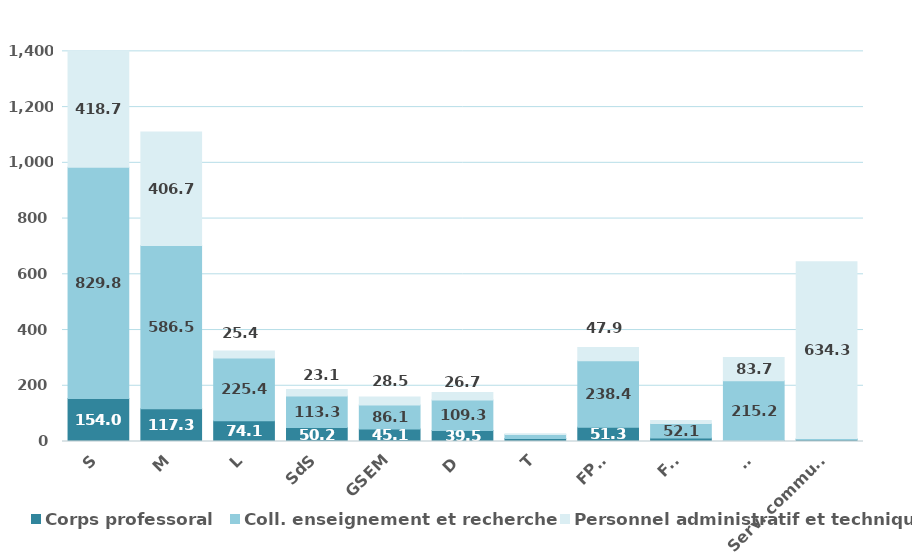
| Category | Corps professoral | Coll. enseignement et recherche | Personnel administratif et technique |
|---|---|---|---|
| S | 154.03 | 829.763 | 418.719 |
| M | 117.291 | 586.451 | 406.72 |
| L | 74.112 | 225.366 | 25.385 |
| SdS | 50.234 | 113.344 | 23.094 |
| GSEM | 45.113 | 86.09 | 28.482 |
| D | 39.475 | 109.342 | 26.716 |
| T | 10.667 | 14.254 | 2.721 |
| FPSE | 51.312 | 238.361 | 47.921 |
| FTI | 12.971 | 52.06 | 10.351 |
| CI | 2.783 | 215.215 | 83.742 |
| Serv. communs | 6.1 | 4.558 | 634.347 |